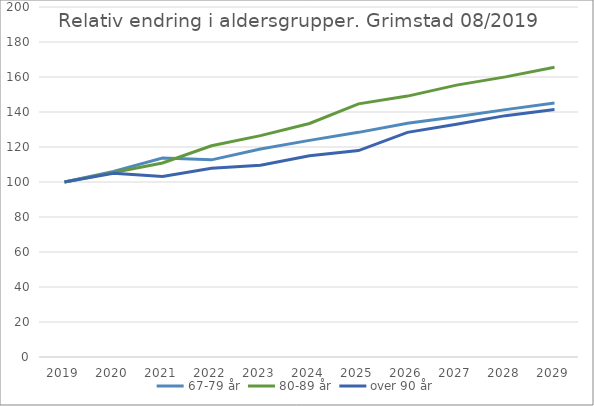
| Category | 67-79 år | 80-89 år | over 90 år |
|---|---|---|---|
| 2019 | 100 | 100 | 100 |
| 2020 | 106.056 | 105.403 | 104.947 |
| 2021 | 113.657 | 110.889 | 103.177 |
| 2022 | 112.654 | 120.725 | 107.8 |
| 2023 | 118.812 | 126.487 | 109.618 |
| 2024 | 123.791 | 133.451 | 114.95 |
| 2025 | 128.369 | 144.641 | 117.963 |
| 2026 | 133.591 | 149.086 | 128.373 |
| 2027 | 137.309 | 155.351 | 132.946 |
| 2028 | 141.364 | 160.069 | 137.92 |
| 2029 | 145.093 | 165.556 | 141.43 |